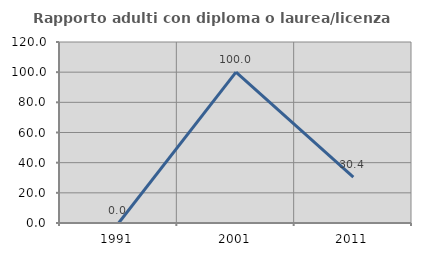
| Category | Rapporto adulti con diploma o laurea/licenza media  |
|---|---|
| 1991.0 | 0 |
| 2001.0 | 100 |
| 2011.0 | 30.435 |